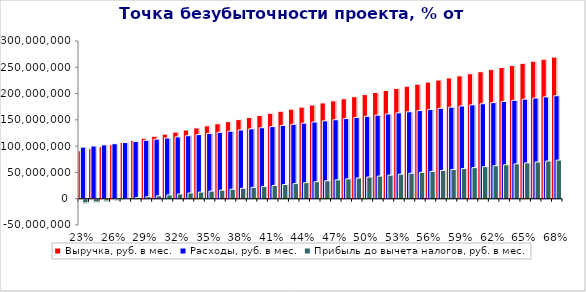
| Category | Выручка, руб. в мес. | Расходы, руб. в мес. | Прибыль до вычета налогов, руб. в мес. |
|---|---|---|---|
| 0.23000000000000007 | 91104278.35 | 98089037.17 | -6984758.82 |
| 0.24000000000000007 | 95065333.931 | 100262356.803 | -5197022.872 |
| 0.25000000000000006 | 99026389.511 | 102435676.436 | -3409286.925 |
| 0.26000000000000006 | 102987445.092 | 104608996.068 | -1621550.977 |
| 0.2700000000000001 | 106948500.672 | 106782315.701 | 166184.971 |
| 0.2800000000000001 | 110909556.252 | 108955635.333 | 1953920.919 |
| 0.2900000000000001 | 114870611.833 | 111128954.966 | 3741656.867 |
| 0.3000000000000001 | 118831667.413 | 113302274.598 | 5529392.815 |
| 0.3100000000000001 | 122792722.994 | 115475594.231 | 7317128.763 |
| 0.3200000000000001 | 126753778.574 | 117648913.864 | 9104864.711 |
| 0.3300000000000001 | 130714834.155 | 119822233.496 | 10892600.658 |
| 0.34000000000000014 | 134675889.735 | 121995553.129 | 12680336.606 |
| 0.35000000000000014 | 138636945.315 | 124168872.761 | 14468072.554 |
| 0.36000000000000015 | 142598000.896 | 126342192.394 | 16255808.502 |
| 0.37000000000000016 | 146559056.476 | 128515512.027 | 18043544.45 |
| 0.38000000000000017 | 150520112.057 | 130688831.659 | 19831280.398 |
| 0.3900000000000002 | 154481167.637 | 132862151.292 | 21619016.346 |
| 0.4000000000000002 | 158442223.218 | 135035470.924 | 23406752.293 |
| 0.4100000000000002 | 162403278.798 | 137208790.557 | 25194488.241 |
| 0.4200000000000002 | 166364334.379 | 139382110.189 | 26982224.189 |
| 0.4300000000000002 | 170325389.959 | 141555429.822 | 28769960.137 |
| 0.4400000000000002 | 174286445.539 | 143728749.455 | 30557696.085 |
| 0.45000000000000023 | 178247501.12 | 145902069.087 | 32345432.033 |
| 0.46000000000000024 | 182208556.7 | 148075388.72 | 34133167.981 |
| 0.47000000000000025 | 186169612.281 | 150248708.352 | 35920903.929 |
| 0.48000000000000026 | 190130667.861 | 152422027.985 | 37708639.876 |
| 0.49000000000000027 | 194091723.442 | 154595347.617 | 39496375.824 |
| 0.5000000000000002 | 198052779.022 | 156768667.25 | 41284111.772 |
| 0.5100000000000002 | 202013834.603 | 158941986.883 | 43071847.72 |
| 0.5200000000000002 | 205974890.183 | 161115306.515 | 44859583.668 |
| 0.5300000000000002 | 209935945.763 | 163288626.148 | 46647319.616 |
| 0.5400000000000003 | 213897001.344 | 165461945.78 | 48435055.564 |
| 0.5500000000000003 | 217858056.924 | 167635265.413 | 50222791.511 |
| 0.5600000000000003 | 221819112.505 | 169808585.045 | 52010527.459 |
| 0.5700000000000003 | 225780168.085 | 171981904.678 | 53798263.407 |
| 0.5800000000000003 | 229741223.666 | 174155224.311 | 55585999.355 |
| 0.5900000000000003 | 233702279.246 | 176328543.943 | 57373735.303 |
| 0.6000000000000003 | 237663334.827 | 178501863.576 | 59161471.251 |
| 0.6100000000000003 | 241624390.407 | 180675183.208 | 60949207.199 |
| 0.6200000000000003 | 245585445.987 | 182848502.841 | 62736943.146 |
| 0.6300000000000003 | 249546501.568 | 185021822.474 | 64524679.094 |
| 0.6400000000000003 | 253507557.148 | 187195142.106 | 66312415.042 |
| 0.6500000000000004 | 257468612.729 | 189368461.739 | 68100150.99 |
| 0.6600000000000004 | 261429668.309 | 191541781.371 | 69887886.938 |
| 0.6700000000000004 | 265390723.89 | 193715101.004 | 71675622.886 |
| 0.6800000000000004 | 269351779.47 | 195888420.636 | 73463358.834 |